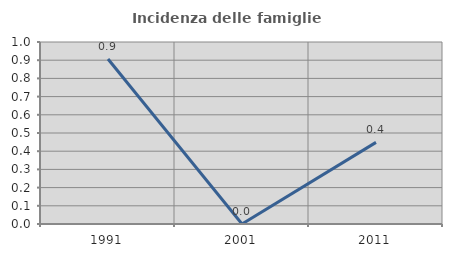
| Category | Incidenza delle famiglie numerose |
|---|---|
| 1991.0 | 0.906 |
| 2001.0 | 0 |
| 2011.0 | 0.448 |